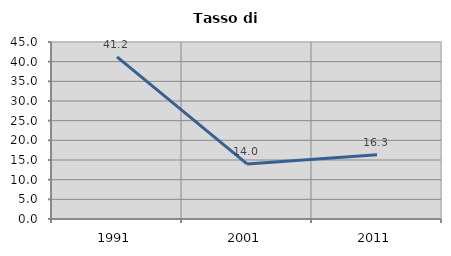
| Category | Tasso di disoccupazione   |
|---|---|
| 1991.0 | 41.214 |
| 2001.0 | 14.004 |
| 2011.0 | 16.336 |